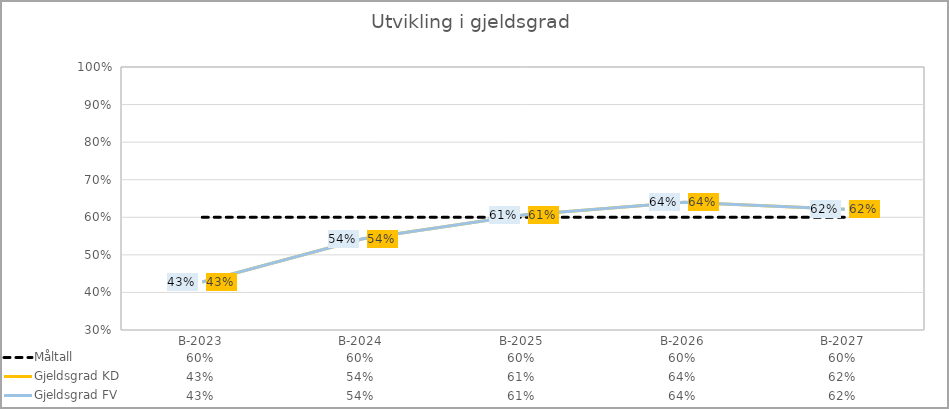
| Category | Måltall | Gjeldsgrad KD | Gjeldsgrad FV |
|---|---|---|---|
| B-2023 | 0.6 | 0.428 | 0.428 |
| B-2024 | 0.6 | 0.543 | 0.543 |
| B-2025 | 0.6 | 0.606 | 0.606 |
| B-2026 | 0.6 | 0.64 | 0.64 |
| B-2027 | 0.6 | 0.621 | 0.621 |